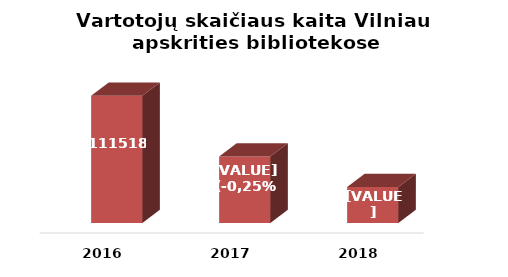
| Category | Series 0 |
|---|---|
| 2016.0 | 111518 |
| 2017.0 | 106974 |
| 2018.0 | 104701 |